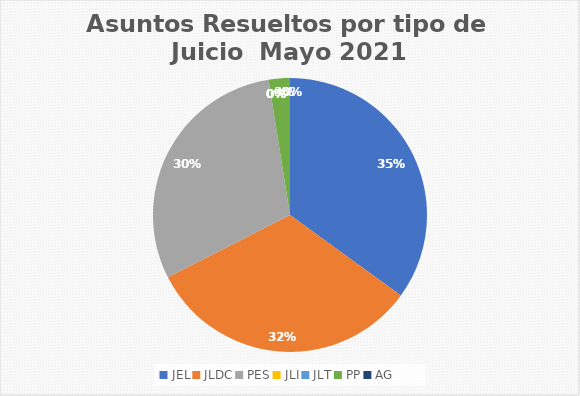
| Category | Asuntos Resueltos por tipo de Juicio  Mayo |
|---|---|
| JEL | 14 |
| JLDC | 13 |
| PES | 12 |
| JLI | 0 |
| JLT | 0 |
| PP | 1 |
| AG | 0 |